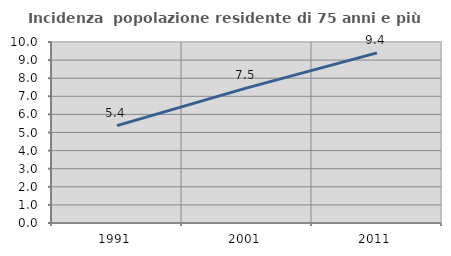
| Category | Incidenza  popolazione residente di 75 anni e più |
|---|---|
| 1991.0 | 5.382 |
| 2001.0 | 7.467 |
| 2011.0 | 9.397 |